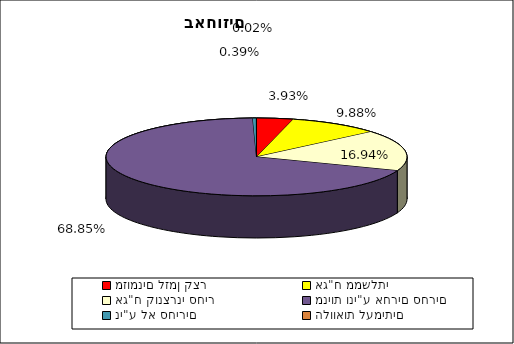
| Category | Series 0 |
|---|---|
| מזומנים לזמן קצר | 0.039 |
| אג"ח ממשלתי | 0.099 |
| אג"ח קונצרני סחיר | 0.169 |
| מניות וני"ע אחרים סחרים | 0.689 |
| ני"ע לא סחירים | 0.004 |
| הלוואות לעמיתים | 0 |